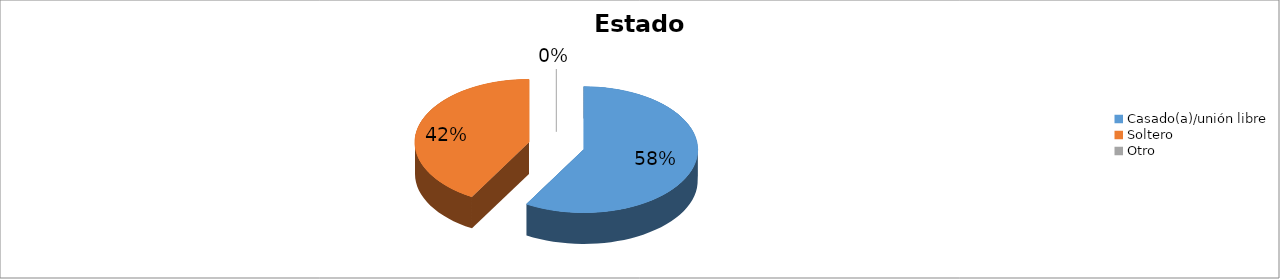
| Category | Series 0 |
|---|---|
| Casado(a)/unión libre | 0.583 |
| Soltero | 0.417 |
| Otro | 0 |